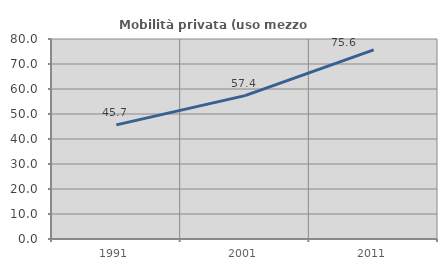
| Category | Mobilità privata (uso mezzo privato) |
|---|---|
| 1991.0 | 45.652 |
| 2001.0 | 57.353 |
| 2011.0 | 75.641 |